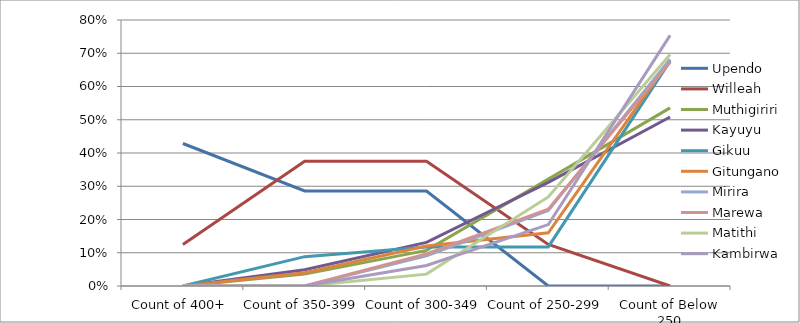
| Category | Upendo | Willeah | Muthigiriri | Kayuyu | Gikuu | Gitungano | Mirira | Marewa | Matithi | Kambirwa |
|---|---|---|---|---|---|---|---|---|---|---|
| Count of 400+ | 0.429 | 0.125 | 0 | 0 | 0 | 0 | 0 | 0 | 0 | 0 |
| Count of 350-399 | 0.286 | 0.375 | 0.036 | 0.049 | 0.088 | 0.04 | 0 | 0 | 0 | 0 |
| Count of 300-349 | 0.286 | 0.375 | 0.107 | 0.131 | 0.118 | 0.12 | 0.091 | 0.096 | 0.036 | 0.062 |
| Count of 250-299 | 0 | 0.125 | 0.321 | 0.311 | 0.118 | 0.16 | 0.227 | 0.231 | 0.268 | 0.185 |
| Count of Below 250 | 0 | 0 | 0.536 | 0.508 | 0.676 | 0.68 | 0.682 | 0.673 | 0.696 | 0.754 |